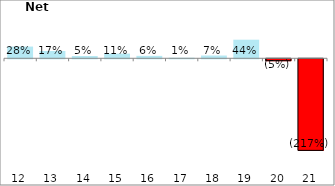
| Category | Series 0 |
|---|---|
| 2012-03-31 | 0.277 |
| 2013-03-31 | 0.173 |
| 2014-03-31 | 0.054 |
| 2015-03-31 | 0.11 |
| 2016-03-31 | 0.057 |
| 2017-03-31 | 0.014 |
| 2018-03-31 | 0.065 |
| 2019-03-31 | 0.44 |
| 2020-03-31 | -0.046 |
| 2021-03-31 | -2.166 |